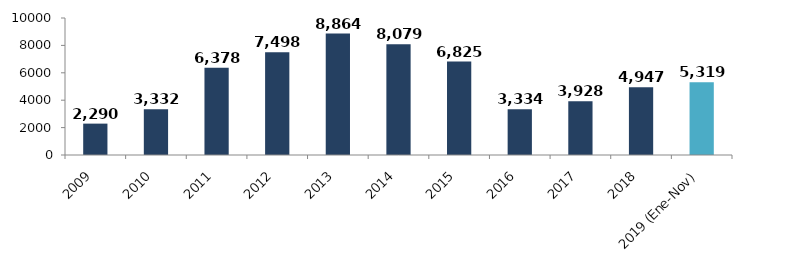
| Category | Series 0 |
|---|---|
| 2009 | 2290.273 |
| 2010 | 3331.554 |
| 2011 | 6377.615 |
| 2012 | 7498.207 |
| 2013 | 8863.622 |
| 2014 | 8079.21 |
| 2015 | 6824.624 |
| 2016 | 3333.564 |
| 2017 | 3928.017 |
| 2018 | 4947.435 |
| 2019 (Ene-Nov) | 5319.265 |